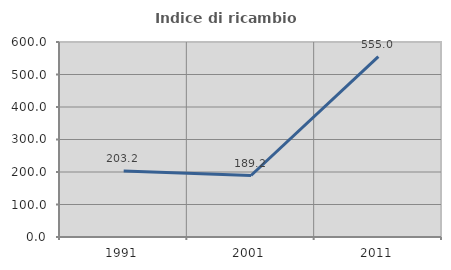
| Category | Indice di ricambio occupazionale  |
|---|---|
| 1991.0 | 203.226 |
| 2001.0 | 189.189 |
| 2011.0 | 555 |